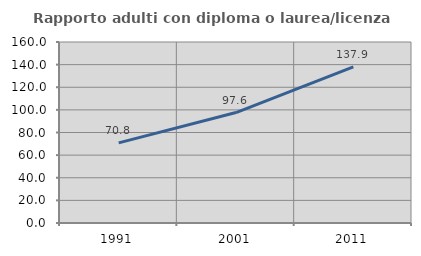
| Category | Rapporto adulti con diploma o laurea/licenza media  |
|---|---|
| 1991.0 | 70.787 |
| 2001.0 | 97.619 |
| 2011.0 | 137.945 |